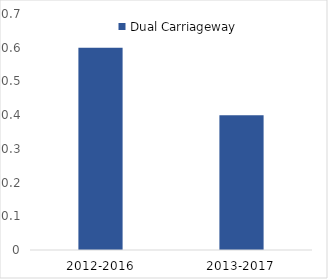
| Category | Dual Carriageway |
|---|---|
| 2012-2016 | 0.6 |
| 2013-2017 | 0.4 |